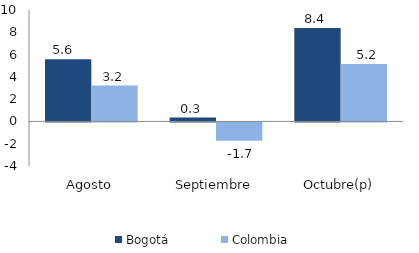
| Category | Bogotá | Colombia |
|---|---|---|
| Agosto | 5.569 | 3.214 |
| Septiembre | 0.348 | -1.651 |
| Octubre(p) | 8.391 | 5.156 |